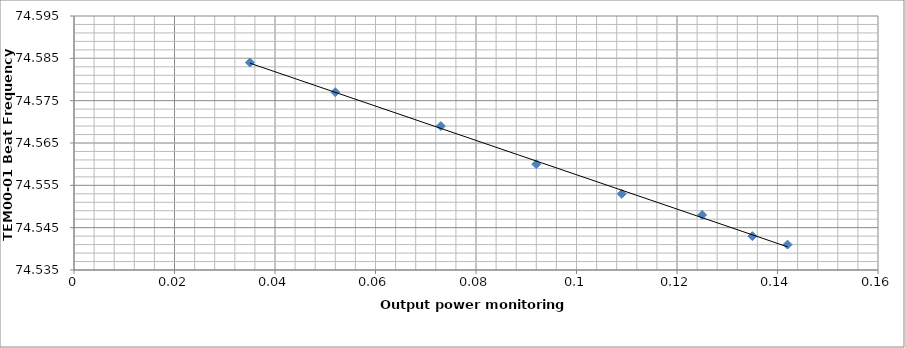
| Category | Series 0 |
|---|---|
| 0.142 | 74.541 |
| 0.135 | 74.543 |
| 0.125 | 74.548 |
| 0.109 | 74.553 |
| 0.092 | 74.56 |
| 0.073 | 74.569 |
| 0.052 | 74.577 |
| 0.035 | 74.584 |